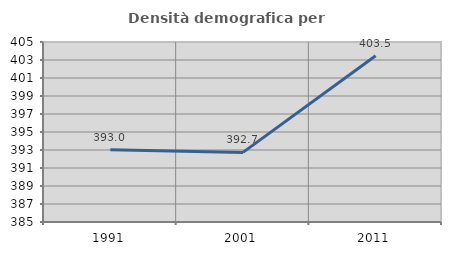
| Category | Densità demografica |
|---|---|
| 1991.0 | 393.032 |
| 2001.0 | 392.732 |
| 2011.0 | 403.473 |